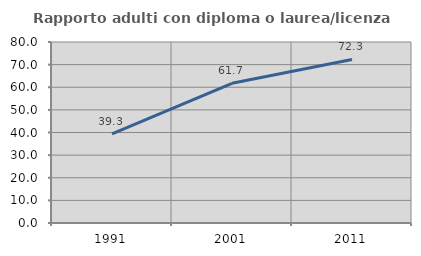
| Category | Rapporto adulti con diploma o laurea/licenza media  |
|---|---|
| 1991.0 | 39.344 |
| 2001.0 | 61.728 |
| 2011.0 | 72.289 |